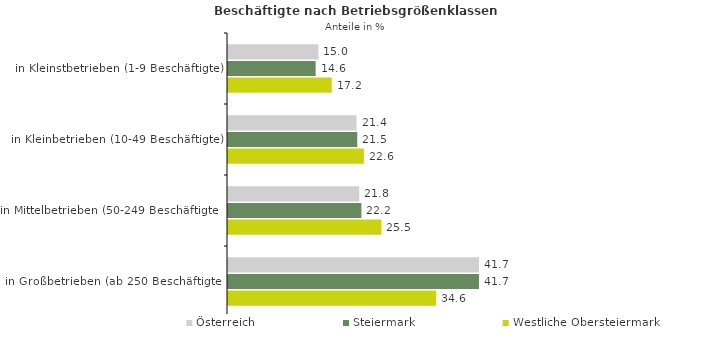
| Category | Österreich | Steiermark | Westliche Obersteiermark |
|---|---|---|---|
| in Kleinstbetrieben (1-9 Beschäftigte) | 15.046 | 14.574 | 17.248 |
| in Kleinbetrieben (10-49 Beschäftigte) | 21.375 | 21.498 | 22.594 |
| in Mittelbetrieben (50-249 Beschäftigte) | 21.831 | 22.187 | 25.526 |
| in Großbetrieben (ab 250 Beschäftigte) | 41.748 | 41.742 | 34.631 |